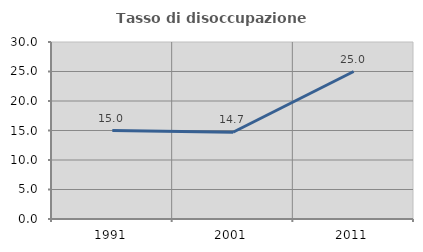
| Category | Tasso di disoccupazione giovanile  |
|---|---|
| 1991.0 | 15 |
| 2001.0 | 14.706 |
| 2011.0 | 25 |